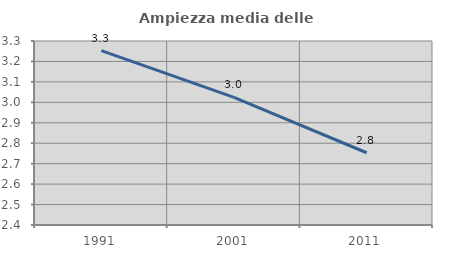
| Category | Ampiezza media delle famiglie |
|---|---|
| 1991.0 | 3.253 |
| 2001.0 | 3.024 |
| 2011.0 | 2.753 |